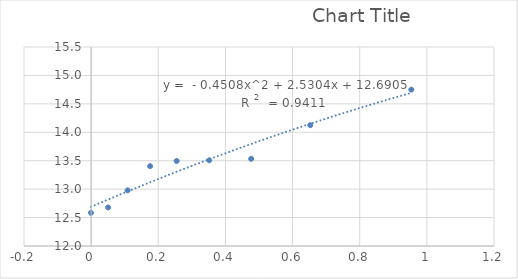
| Category | Series 0 |
|---|---|
| 0.953713365929573 | 14.75 |
| 0.6526833702655918 | 14.125 |
| 0.4765921112099106 | 13.533 |
| 0.35165337460161056 | 13.507 |
| 0.2547433615935542 | 13.495 |
| 0.1755621155459294 | 13.405 |
| 0.10861532591531615 | 12.979 |
| 0.05062337893762938 | 12.679 |
| -0.0005291435097519106 | 12.583 |